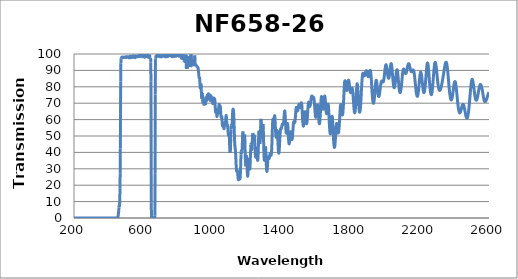
| Category | Transmission (%) |
|---|---|
| 2600.0 | 76.495 |
| 2599.0 | 76.409 |
| 2598.0 | 76.32 |
| 2597.0 | 76.13 |
| 2596.0 | 75.853 |
| 2595.0 | 75.54 |
| 2594.0 | 75.215 |
| 2593.0 | 74.875 |
| 2592.0 | 74.459 |
| 2591.0 | 74.133 |
| 2590.0 | 73.738 |
| 2589.0 | 73.397 |
| 2588.0 | 73.108 |
| 2587.0 | 72.826 |
| 2586.0 | 72.492 |
| 2585.0 | 72.167 |
| 2584.0 | 71.843 |
| 2583.0 | 71.6 |
| 2582.0 | 71.38 |
| 2581.0 | 71.221 |
| 2580.0 | 71.106 |
| 2579.0 | 71.011 |
| 2578.0 | 70.978 |
| 2577.0 | 70.971 |
| 2576.0 | 70.971 |
| 2575.0 | 71.068 |
| 2574.0 | 71.209 |
| 2573.0 | 71.421 |
| 2572.0 | 71.724 |
| 2571.0 | 72.112 |
| 2570.0 | 72.565 |
| 2569.0 | 73.155 |
| 2568.0 | 73.689 |
| 2567.0 | 74.33 |
| 2566.0 | 74.969 |
| 2565.0 | 75.629 |
| 2564.0 | 76.266 |
| 2563.0 | 76.9 |
| 2562.0 | 77.528 |
| 2561.0 | 78.076 |
| 2560.0 | 78.592 |
| 2559.0 | 79.073 |
| 2558.0 | 79.54 |
| 2557.0 | 79.952 |
| 2556.0 | 80.332 |
| 2555.0 | 80.634 |
| 2554.0 | 80.89 |
| 2553.0 | 81.133 |
| 2552.0 | 81.311 |
| 2551.0 | 81.387 |
| 2550.0 | 81.414 |
| 2549.0 | 81.342 |
| 2548.0 | 81.162 |
| 2547.0 | 80.871 |
| 2546.0 | 80.526 |
| 2545.0 | 80.151 |
| 2544.0 | 79.684 |
| 2543.0 | 79.217 |
| 2542.0 | 78.659 |
| 2541.0 | 78.131 |
| 2540.0 | 77.584 |
| 2539.0 | 76.984 |
| 2538.0 | 76.328 |
| 2537.0 | 75.659 |
| 2536.0 | 75.042 |
| 2535.0 | 74.496 |
| 2534.0 | 73.933 |
| 2533.0 | 73.467 |
| 2532.0 | 73.031 |
| 2531.0 | 72.627 |
| 2530.0 | 72.244 |
| 2529.0 | 72.003 |
| 2528.0 | 71.897 |
| 2527.0 | 71.824 |
| 2526.0 | 71.833 |
| 2525.0 | 71.914 |
| 2524.0 | 72.063 |
| 2523.0 | 72.305 |
| 2522.0 | 72.639 |
| 2521.0 | 73.029 |
| 2520.0 | 73.538 |
| 2519.0 | 74.135 |
| 2518.0 | 74.8 |
| 2517.0 | 75.566 |
| 2516.0 | 76.387 |
| 2515.0 | 77.208 |
| 2514.0 | 78.04 |
| 2513.0 | 78.874 |
| 2512.0 | 79.705 |
| 2511.0 | 80.519 |
| 2510.0 | 81.334 |
| 2509.0 | 82.048 |
| 2508.0 | 82.728 |
| 2507.0 | 83.314 |
| 2506.0 | 83.803 |
| 2505.0 | 84.173 |
| 2504.0 | 84.427 |
| 2503.0 | 84.54 |
| 2502.0 | 84.513 |
| 2501.0 | 84.3 |
| 2500.0 | 83.919 |
| 2499.0 | 83.403 |
| 2498.0 | 82.756 |
| 2497.0 | 81.971 |
| 2496.0 | 81.099 |
| 2495.0 | 80.129 |
| 2494.0 | 79.06 |
| 2493.0 | 77.856 |
| 2492.0 | 76.65 |
| 2491.0 | 75.4 |
| 2490.0 | 74.142 |
| 2489.0 | 72.907 |
| 2488.0 | 71.695 |
| 2487.0 | 70.524 |
| 2486.0 | 69.337 |
| 2485.0 | 68.188 |
| 2484.0 | 67.08 |
| 2483.0 | 66.094 |
| 2482.0 | 65.18 |
| 2481.0 | 64.321 |
| 2480.0 | 63.587 |
| 2479.0 | 62.937 |
| 2478.0 | 62.362 |
| 2477.0 | 61.887 |
| 2476.0 | 61.492 |
| 2475.0 | 61.199 |
| 2474.0 | 61.006 |
| 2473.0 | 60.915 |
| 2472.0 | 60.911 |
| 2471.0 | 60.984 |
| 2470.0 | 61.124 |
| 2469.0 | 61.353 |
| 2468.0 | 61.675 |
| 2467.0 | 62.037 |
| 2466.0 | 62.456 |
| 2465.0 | 62.942 |
| 2464.0 | 63.494 |
| 2463.0 | 64.055 |
| 2462.0 | 64.641 |
| 2461.0 | 65.209 |
| 2460.0 | 65.769 |
| 2459.0 | 66.324 |
| 2458.0 | 66.867 |
| 2457.0 | 67.392 |
| 2456.0 | 67.86 |
| 2455.0 | 68.25 |
| 2454.0 | 68.59 |
| 2453.0 | 68.873 |
| 2452.0 | 69.098 |
| 2451.0 | 69.234 |
| 2450.0 | 69.29 |
| 2449.0 | 69.274 |
| 2448.0 | 69.17 |
| 2447.0 | 69.005 |
| 2446.0 | 68.792 |
| 2445.0 | 68.509 |
| 2444.0 | 68.149 |
| 2443.0 | 67.776 |
| 2442.0 | 67.405 |
| 2441.0 | 67.006 |
| 2440.0 | 66.566 |
| 2439.0 | 66.11 |
| 2438.0 | 65.677 |
| 2437.0 | 65.274 |
| 2436.0 | 64.904 |
| 2435.0 | 64.6 |
| 2434.0 | 64.364 |
| 2433.0 | 64.199 |
| 2432.0 | 64.097 |
| 2431.0 | 64.05 |
| 2430.0 | 64.094 |
| 2429.0 | 64.235 |
| 2428.0 | 64.468 |
| 2427.0 | 64.779 |
| 2426.0 | 65.18 |
| 2425.0 | 65.68 |
| 2424.0 | 66.28 |
| 2423.0 | 66.969 |
| 2422.0 | 67.726 |
| 2421.0 | 68.543 |
| 2420.0 | 69.447 |
| 2419.0 | 70.427 |
| 2418.0 | 71.44 |
| 2417.0 | 72.499 |
| 2416.0 | 73.608 |
| 2415.0 | 74.72 |
| 2414.0 | 75.829 |
| 2413.0 | 76.925 |
| 2412.0 | 77.946 |
| 2411.0 | 78.907 |
| 2410.0 | 79.812 |
| 2409.0 | 80.644 |
| 2408.0 | 81.404 |
| 2407.0 | 82.067 |
| 2406.0 | 82.571 |
| 2405.0 | 82.915 |
| 2404.0 | 83.136 |
| 2403.0 | 83.213 |
| 2402.0 | 83.129 |
| 2401.0 | 82.928 |
| 2400.0 | 82.621 |
| 2399.0 | 82.181 |
| 2398.0 | 81.61 |
| 2397.0 | 80.934 |
| 2396.0 | 80.197 |
| 2395.0 | 79.392 |
| 2394.0 | 78.541 |
| 2393.0 | 77.725 |
| 2392.0 | 76.932 |
| 2391.0 | 76.114 |
| 2390.0 | 75.334 |
| 2389.0 | 74.619 |
| 2388.0 | 73.967 |
| 2387.0 | 73.398 |
| 2386.0 | 72.901 |
| 2385.0 | 72.53 |
| 2384.0 | 72.277 |
| 2383.0 | 72.089 |
| 2382.0 | 71.993 |
| 2381.0 | 72.019 |
| 2380.0 | 72.148 |
| 2379.0 | 72.402 |
| 2378.0 | 72.775 |
| 2377.0 | 73.243 |
| 2376.0 | 73.8 |
| 2375.0 | 74.452 |
| 2374.0 | 75.21 |
| 2373.0 | 76.052 |
| 2372.0 | 76.965 |
| 2371.0 | 77.954 |
| 2370.0 | 79.008 |
| 2369.0 | 80.146 |
| 2368.0 | 81.312 |
| 2367.0 | 82.496 |
| 2366.0 | 83.714 |
| 2365.0 | 84.945 |
| 2364.0 | 86.15 |
| 2363.0 | 87.334 |
| 2362.0 | 88.523 |
| 2361.0 | 89.638 |
| 2360.0 | 90.678 |
| 2359.0 | 91.639 |
| 2358.0 | 92.477 |
| 2357.0 | 93.212 |
| 2356.0 | 93.813 |
| 2355.0 | 94.303 |
| 2354.0 | 94.68 |
| 2353.0 | 94.917 |
| 2352.0 | 95.015 |
| 2351.0 | 95.035 |
| 2350.0 | 94.907 |
| 2349.0 | 94.658 |
| 2348.0 | 94.324 |
| 2347.0 | 93.911 |
| 2346.0 | 93.448 |
| 2345.0 | 92.898 |
| 2344.0 | 92.342 |
| 2343.0 | 91.72 |
| 2342.0 | 91.065 |
| 2341.0 | 90.391 |
| 2340.0 | 89.706 |
| 2339.0 | 89.019 |
| 2338.0 | 88.344 |
| 2337.0 | 87.693 |
| 2336.0 | 87.039 |
| 2335.0 | 86.388 |
| 2334.0 | 85.738 |
| 2333.0 | 85.082 |
| 2332.0 | 84.486 |
| 2331.0 | 83.885 |
| 2330.0 | 83.292 |
| 2329.0 | 82.741 |
| 2328.0 | 82.194 |
| 2327.0 | 81.684 |
| 2326.0 | 81.163 |
| 2325.0 | 80.65 |
| 2324.0 | 80.172 |
| 2323.0 | 79.741 |
| 2322.0 | 79.358 |
| 2321.0 | 78.993 |
| 2320.0 | 78.66 |
| 2319.0 | 78.373 |
| 2318.0 | 78.142 |
| 2317.0 | 77.942 |
| 2316.0 | 77.813 |
| 2315.0 | 77.762 |
| 2314.0 | 77.79 |
| 2313.0 | 77.89 |
| 2312.0 | 78.071 |
| 2311.0 | 78.334 |
| 2310.0 | 78.687 |
| 2309.0 | 79.135 |
| 2308.0 | 79.651 |
| 2307.0 | 80.286 |
| 2306.0 | 80.965 |
| 2305.0 | 81.736 |
| 2304.0 | 82.592 |
| 2303.0 | 83.545 |
| 2302.0 | 84.57 |
| 2301.0 | 85.586 |
| 2300.0 | 86.652 |
| 2299.0 | 87.748 |
| 2298.0 | 88.831 |
| 2297.0 | 89.883 |
| 2296.0 | 90.894 |
| 2295.0 | 91.828 |
| 2294.0 | 92.687 |
| 2293.0 | 93.422 |
| 2292.0 | 94.022 |
| 2291.0 | 94.479 |
| 2290.0 | 94.778 |
| 2289.0 | 94.896 |
| 2288.0 | 94.831 |
| 2287.0 | 94.584 |
| 2286.0 | 94.128 |
| 2285.0 | 93.447 |
| 2284.0 | 92.644 |
| 2283.0 | 91.668 |
| 2282.0 | 90.545 |
| 2281.0 | 89.353 |
| 2280.0 | 88.027 |
| 2279.0 | 86.707 |
| 2278.0 | 85.363 |
| 2277.0 | 83.966 |
| 2276.0 | 82.61 |
| 2275.0 | 81.32 |
| 2274.0 | 80.096 |
| 2273.0 | 78.986 |
| 2272.0 | 78.001 |
| 2271.0 | 77.145 |
| 2270.0 | 76.496 |
| 2269.0 | 75.927 |
| 2268.0 | 75.502 |
| 2267.0 | 75.273 |
| 2266.0 | 75.22 |
| 2265.0 | 75.319 |
| 2264.0 | 75.602 |
| 2263.0 | 76.034 |
| 2262.0 | 76.646 |
| 2261.0 | 77.388 |
| 2260.0 | 78.268 |
| 2259.0 | 79.281 |
| 2258.0 | 80.401 |
| 2257.0 | 81.66 |
| 2256.0 | 82.922 |
| 2255.0 | 84.26 |
| 2254.0 | 85.663 |
| 2253.0 | 87.085 |
| 2252.0 | 88.416 |
| 2251.0 | 89.735 |
| 2250.0 | 90.938 |
| 2249.0 | 92.022 |
| 2248.0 | 92.953 |
| 2247.0 | 93.674 |
| 2246.0 | 94.138 |
| 2245.0 | 94.452 |
| 2244.0 | 94.453 |
| 2243.0 | 94.223 |
| 2242.0 | 93.71 |
| 2241.0 | 93.033 |
| 2240.0 | 92.127 |
| 2239.0 | 91.004 |
| 2238.0 | 89.746 |
| 2237.0 | 88.451 |
| 2236.0 | 87.066 |
| 2235.0 | 85.664 |
| 2234.0 | 84.247 |
| 2233.0 | 82.901 |
| 2232.0 | 81.64 |
| 2231.0 | 80.481 |
| 2230.0 | 79.5 |
| 2229.0 | 78.555 |
| 2228.0 | 77.791 |
| 2227.0 | 77.2 |
| 2226.0 | 76.787 |
| 2225.0 | 76.517 |
| 2224.0 | 76.425 |
| 2223.0 | 76.521 |
| 2222.0 | 76.753 |
| 2221.0 | 77.148 |
| 2220.0 | 77.688 |
| 2219.0 | 78.358 |
| 2218.0 | 79.117 |
| 2217.0 | 79.975 |
| 2216.0 | 80.936 |
| 2215.0 | 81.907 |
| 2214.0 | 82.938 |
| 2213.0 | 84.019 |
| 2212.0 | 84.961 |
| 2211.0 | 85.931 |
| 2210.0 | 86.796 |
| 2209.0 | 87.523 |
| 2208.0 | 88.125 |
| 2207.0 | 88.563 |
| 2206.0 | 88.824 |
| 2205.0 | 88.928 |
| 2204.0 | 88.787 |
| 2203.0 | 88.413 |
| 2202.0 | 87.878 |
| 2201.0 | 87.128 |
| 2200.0 | 86.29 |
| 2199.0 | 85.287 |
| 2198.0 | 84.215 |
| 2197.0 | 83.017 |
| 2196.0 | 81.876 |
| 2195.0 | 80.682 |
| 2194.0 | 79.587 |
| 2193.0 | 78.523 |
| 2192.0 | 77.551 |
| 2191.0 | 76.664 |
| 2190.0 | 75.891 |
| 2189.0 | 75.264 |
| 2188.0 | 74.752 |
| 2187.0 | 74.392 |
| 2186.0 | 74.218 |
| 2185.0 | 74.193 |
| 2184.0 | 74.315 |
| 2183.0 | 74.555 |
| 2182.0 | 74.983 |
| 2181.0 | 75.541 |
| 2180.0 | 76.151 |
| 2179.0 | 76.902 |
| 2178.0 | 77.762 |
| 2177.0 | 78.767 |
| 2176.0 | 79.745 |
| 2175.0 | 80.778 |
| 2174.0 | 81.865 |
| 2173.0 | 82.965 |
| 2172.0 | 84.038 |
| 2171.0 | 85.124 |
| 2170.0 | 86.09 |
| 2169.0 | 86.996 |
| 2168.0 | 87.812 |
| 2167.0 | 88.499 |
| 2166.0 | 89.095 |
| 2165.0 | 89.635 |
| 2164.0 | 89.935 |
| 2163.0 | 90.137 |
| 2162.0 | 90.275 |
| 2161.0 | 90.296 |
| 2160.0 | 90.253 |
| 2159.0 | 90.144 |
| 2158.0 | 89.977 |
| 2157.0 | 89.787 |
| 2156.0 | 89.596 |
| 2155.0 | 89.406 |
| 2154.0 | 89.253 |
| 2153.0 | 89.176 |
| 2152.0 | 89.165 |
| 2151.0 | 89.229 |
| 2150.0 | 89.328 |
| 2149.0 | 89.488 |
| 2148.0 | 89.744 |
| 2147.0 | 90.086 |
| 2146.0 | 90.477 |
| 2145.0 | 90.923 |
| 2144.0 | 91.368 |
| 2143.0 | 91.844 |
| 2142.0 | 92.317 |
| 2141.0 | 92.763 |
| 2140.0 | 93.192 |
| 2139.0 | 93.521 |
| 2138.0 | 93.792 |
| 2137.0 | 94 |
| 2136.0 | 94.11 |
| 2135.0 | 94.096 |
| 2134.0 | 93.97 |
| 2133.0 | 93.798 |
| 2132.0 | 93.526 |
| 2131.0 | 93.168 |
| 2130.0 | 92.735 |
| 2129.0 | 92.236 |
| 2128.0 | 91.706 |
| 2127.0 | 91.175 |
| 2126.0 | 90.621 |
| 2125.0 | 90.085 |
| 2124.0 | 89.572 |
| 2123.0 | 89.102 |
| 2122.0 | 88.731 |
| 2121.0 | 88.414 |
| 2120.0 | 88.207 |
| 2119.0 | 88.094 |
| 2118.0 | 88.066 |
| 2117.0 | 88.132 |
| 2116.0 | 88.326 |
| 2115.0 | 88.555 |
| 2114.0 | 88.83 |
| 2113.0 | 89.181 |
| 2112.0 | 89.567 |
| 2111.0 | 89.902 |
| 2110.0 | 90.228 |
| 2109.0 | 90.538 |
| 2108.0 | 90.745 |
| 2107.0 | 90.855 |
| 2106.0 | 90.843 |
| 2105.0 | 90.694 |
| 2104.0 | 90.381 |
| 2103.0 | 89.904 |
| 2102.0 | 89.307 |
| 2101.0 | 88.557 |
| 2100.0 | 87.695 |
| 2099.0 | 86.736 |
| 2098.0 | 85.716 |
| 2097.0 | 84.647 |
| 2096.0 | 83.513 |
| 2095.0 | 82.405 |
| 2094.0 | 81.302 |
| 2093.0 | 80.279 |
| 2092.0 | 79.381 |
| 2091.0 | 78.553 |
| 2090.0 | 77.85 |
| 2089.0 | 77.302 |
| 2088.0 | 76.856 |
| 2087.0 | 76.574 |
| 2086.0 | 76.45 |
| 2085.0 | 76.501 |
| 2084.0 | 76.729 |
| 2083.0 | 77.159 |
| 2082.0 | 77.715 |
| 2081.0 | 78.426 |
| 2080.0 | 79.3 |
| 2079.0 | 80.312 |
| 2078.0 | 81.425 |
| 2077.0 | 82.623 |
| 2076.0 | 83.816 |
| 2075.0 | 85.063 |
| 2074.0 | 86.281 |
| 2073.0 | 87.391 |
| 2072.0 | 88.388 |
| 2071.0 | 89.238 |
| 2070.0 | 89.848 |
| 2069.0 | 90.24 |
| 2068.0 | 90.384 |
| 2067.0 | 90.287 |
| 2066.0 | 89.948 |
| 2065.0 | 89.396 |
| 2064.0 | 88.663 |
| 2063.0 | 87.757 |
| 2062.0 | 86.734 |
| 2061.0 | 85.694 |
| 2060.0 | 84.633 |
| 2059.0 | 83.591 |
| 2058.0 | 82.61 |
| 2057.0 | 81.712 |
| 2056.0 | 80.943 |
| 2055.0 | 80.313 |
| 2054.0 | 79.828 |
| 2053.0 | 79.534 |
| 2052.0 | 79.423 |
| 2051.0 | 79.475 |
| 2050.0 | 79.721 |
| 2049.0 | 80.153 |
| 2048.0 | 80.775 |
| 2047.0 | 81.564 |
| 2046.0 | 82.502 |
| 2045.0 | 83.59 |
| 2044.0 | 84.776 |
| 2043.0 | 86.058 |
| 2042.0 | 87.411 |
| 2041.0 | 88.733 |
| 2040.0 | 89.97 |
| 2039.0 | 91.11 |
| 2038.0 | 92.131 |
| 2037.0 | 93.018 |
| 2036.0 | 93.65 |
| 2035.0 | 94.009 |
| 2034.0 | 94.15 |
| 2033.0 | 94.025 |
| 2032.0 | 93.654 |
| 2031.0 | 93.097 |
| 2030.0 | 92.383 |
| 2029.0 | 91.513 |
| 2028.0 | 90.552 |
| 2027.0 | 89.597 |
| 2026.0 | 88.655 |
| 2025.0 | 87.763 |
| 2024.0 | 86.982 |
| 2023.0 | 86.308 |
| 2022.0 | 85.784 |
| 2021.0 | 85.424 |
| 2020.0 | 85.233 |
| 2019.0 | 85.213 |
| 2018.0 | 85.359 |
| 2017.0 | 85.662 |
| 2016.0 | 86.11 |
| 2015.0 | 86.699 |
| 2014.0 | 87.398 |
| 2013.0 | 88.165 |
| 2012.0 | 89.017 |
| 2011.0 | 89.882 |
| 2010.0 | 90.759 |
| 2009.0 | 91.562 |
| 2008.0 | 92.226 |
| 2007.0 | 92.777 |
| 2006.0 | 93.194 |
| 2005.0 | 93.441 |
| 2004.0 | 93.487 |
| 2003.0 | 93.322 |
| 2002.0 | 92.95 |
| 2001.0 | 92.396 |
| 2000.0 | 91.67 |
| 1999.0 | 90.831 |
| 1998.0 | 89.895 |
| 1997.0 | 88.912 |
| 1996.0 | 87.94 |
| 1995.0 | 86.977 |
| 1994.0 | 86.056 |
| 1993.0 | 85.229 |
| 1992.0 | 84.518 |
| 1991.0 | 83.927 |
| 1990.0 | 83.482 |
| 1989.0 | 83.164 |
| 1988.0 | 82.947 |
| 1987.0 | 82.863 |
| 1986.0 | 82.869 |
| 1985.0 | 82.951 |
| 1984.0 | 83.081 |
| 1983.0 | 83.23 |
| 1982.0 | 83.369 |
| 1981.0 | 83.476 |
| 1980.0 | 83.519 |
| 1979.0 | 83.453 |
| 1978.0 | 83.295 |
| 1977.0 | 83.027 |
| 1976.0 | 82.623 |
| 1975.0 | 82.09 |
| 1974.0 | 81.444 |
| 1973.0 | 80.733 |
| 1972.0 | 79.899 |
| 1971.0 | 79.041 |
| 1970.0 | 78.212 |
| 1969.0 | 77.365 |
| 1968.0 | 76.505 |
| 1967.0 | 75.761 |
| 1966.0 | 75.15 |
| 1965.0 | 74.663 |
| 1964.0 | 74.277 |
| 1963.0 | 74.07 |
| 1962.0 | 74.036 |
| 1961.0 | 74.192 |
| 1960.0 | 74.541 |
| 1959.0 | 75.08 |
| 1958.0 | 75.751 |
| 1957.0 | 76.6 |
| 1956.0 | 77.529 |
| 1955.0 | 78.603 |
| 1954.0 | 79.696 |
| 1953.0 | 80.723 |
| 1952.0 | 81.749 |
| 1951.0 | 82.666 |
| 1950.0 | 83.34 |
| 1949.0 | 83.812 |
| 1948.0 | 84.025 |
| 1947.0 | 83.938 |
| 1946.0 | 83.537 |
| 1945.0 | 82.887 |
| 1944.0 | 81.962 |
| 1943.0 | 80.906 |
| 1942.0 | 79.682 |
| 1941.0 | 78.352 |
| 1940.0 | 76.945 |
| 1939.0 | 75.545 |
| 1938.0 | 74.218 |
| 1937.0 | 73 |
| 1936.0 | 71.998 |
| 1935.0 | 71.189 |
| 1934.0 | 70.548 |
| 1933.0 | 70.138 |
| 1932.0 | 69.931 |
| 1931.0 | 69.978 |
| 1930.0 | 70.23 |
| 1929.0 | 70.734 |
| 1928.0 | 71.495 |
| 1927.0 | 72.473 |
| 1926.0 | 73.657 |
| 1925.0 | 74.984 |
| 1924.0 | 76.434 |
| 1923.0 | 78.027 |
| 1922.0 | 79.839 |
| 1921.0 | 81.772 |
| 1920.0 | 83.596 |
| 1919.0 | 85.242 |
| 1918.0 | 86.724 |
| 1917.0 | 87.857 |
| 1916.0 | 88.733 |
| 1915.0 | 89.407 |
| 1914.0 | 89.894 |
| 1913.0 | 90.047 |
| 1912.0 | 89.941 |
| 1911.0 | 89.673 |
| 1910.0 | 89.291 |
| 1909.0 | 88.844 |
| 1908.0 | 88.32 |
| 1907.0 | 87.74 |
| 1906.0 | 87.143 |
| 1905.0 | 86.649 |
| 1904.0 | 86.308 |
| 1903.0 | 86.096 |
| 1902.0 | 86.074 |
| 1901.0 | 86.184 |
| 1900.0 | 86.462 |
| 1899.0 | 86.794 |
| 1898.0 | 87.159 |
| 1897.0 | 87.694 |
| 1896.0 | 88.136 |
| 1895.0 | 88.514 |
| 1894.0 | 88.987 |
| 1893.0 | 89.339 |
| 1892.0 | 89.641 |
| 1891.0 | 89.814 |
| 1890.0 | 89.771 |
| 1889.0 | 89.626 |
| 1888.0 | 89.479 |
| 1887.0 | 89.218 |
| 1886.0 | 88.857 |
| 1885.0 | 88.413 |
| 1884.0 | 87.944 |
| 1883.0 | 87.486 |
| 1882.0 | 87.097 |
| 1881.0 | 86.799 |
| 1880.0 | 86.659 |
| 1879.0 | 86.623 |
| 1878.0 | 86.676 |
| 1877.0 | 86.872 |
| 1876.0 | 87.179 |
| 1875.0 | 87.482 |
| 1874.0 | 87.815 |
| 1873.0 | 88.038 |
| 1872.0 | 88.232 |
| 1871.0 | 88.268 |
| 1870.0 | 88.078 |
| 1869.0 | 87.587 |
| 1868.0 | 86.813 |
| 1867.0 | 85.785 |
| 1866.0 | 84.556 |
| 1865.0 | 83.071 |
| 1864.0 | 81.392 |
| 1863.0 | 79.567 |
| 1862.0 | 77.652 |
| 1861.0 | 75.404 |
| 1860.0 | 73.223 |
| 1859.0 | 71.191 |
| 1858.0 | 69.442 |
| 1857.0 | 67.973 |
| 1856.0 | 66.793 |
| 1855.0 | 65.82 |
| 1854.0 | 65.071 |
| 1853.0 | 64.631 |
| 1852.0 | 64.461 |
| 1851.0 | 64.608 |
| 1850.0 | 65.147 |
| 1849.0 | 66.042 |
| 1848.0 | 67.405 |
| 1847.0 | 68.913 |
| 1846.0 | 70.651 |
| 1845.0 | 72.109 |
| 1844.0 | 73.716 |
| 1843.0 | 75.611 |
| 1842.0 | 77.558 |
| 1841.0 | 79.414 |
| 1840.0 | 80.747 |
| 1839.0 | 81.598 |
| 1838.0 | 81.907 |
| 1837.0 | 81.738 |
| 1836.0 | 81.013 |
| 1835.0 | 79.793 |
| 1834.0 | 78.367 |
| 1833.0 | 76.814 |
| 1832.0 | 74.901 |
| 1831.0 | 72.905 |
| 1830.0 | 70.749 |
| 1829.0 | 68.926 |
| 1828.0 | 67.428 |
| 1827.0 | 66.107 |
| 1826.0 | 65.027 |
| 1825.0 | 64.442 |
| 1824.0 | 64.145 |
| 1823.0 | 64.229 |
| 1822.0 | 64.631 |
| 1821.0 | 65.223 |
| 1820.0 | 66.083 |
| 1819.0 | 67.132 |
| 1818.0 | 68.396 |
| 1817.0 | 69.867 |
| 1816.0 | 71.561 |
| 1815.0 | 73.088 |
| 1814.0 | 74.538 |
| 1813.0 | 75.849 |
| 1812.0 | 77.04 |
| 1811.0 | 77.987 |
| 1810.0 | 78.672 |
| 1809.0 | 79.099 |
| 1808.0 | 79.175 |
| 1807.0 | 79.024 |
| 1806.0 | 78.694 |
| 1805.0 | 78.214 |
| 1804.0 | 77.708 |
| 1803.0 | 77.193 |
| 1802.0 | 76.814 |
| 1801.0 | 76.522 |
| 1800.0 | 76.404 |
| 1799.0 | 76.496 |
| 1798.0 | 76.794 |
| 1797.0 | 77.358 |
| 1796.0 | 78.024 |
| 1795.0 | 78.911 |
| 1794.0 | 79.887 |
| 1793.0 | 80.865 |
| 1792.0 | 81.864 |
| 1791.0 | 82.765 |
| 1790.0 | 83.44 |
| 1789.0 | 83.906 |
| 1788.0 | 84.078 |
| 1787.0 | 83.954 |
| 1786.0 | 83.558 |
| 1785.0 | 82.955 |
| 1784.0 | 82.15 |
| 1783.0 | 81.247 |
| 1782.0 | 80.333 |
| 1781.0 | 79.504 |
| 1780.0 | 78.73 |
| 1779.0 | 78.173 |
| 1778.0 | 77.832 |
| 1777.0 | 77.734 |
| 1776.0 | 77.883 |
| 1775.0 | 78.287 |
| 1774.0 | 78.881 |
| 1773.0 | 79.664 |
| 1772.0 | 80.567 |
| 1771.0 | 81.505 |
| 1770.0 | 82.394 |
| 1769.0 | 83.16 |
| 1768.0 | 83.601 |
| 1767.0 | 83.706 |
| 1766.0 | 83.365 |
| 1765.0 | 82.587 |
| 1764.0 | 81.334 |
| 1763.0 | 79.706 |
| 1762.0 | 77.747 |
| 1761.0 | 75.583 |
| 1760.0 | 73.273 |
| 1759.0 | 71.066 |
| 1758.0 | 68.944 |
| 1757.0 | 67.117 |
| 1756.0 | 65.524 |
| 1755.0 | 64.257 |
| 1754.0 | 63.43 |
| 1753.0 | 62.951 |
| 1752.0 | 62.824 |
| 1751.0 | 63.046 |
| 1750.0 | 63.58 |
| 1749.0 | 64.365 |
| 1748.0 | 65.343 |
| 1747.0 | 66.401 |
| 1746.0 | 67.45 |
| 1745.0 | 68.338 |
| 1744.0 | 68.964 |
| 1743.0 | 69.221 |
| 1742.0 | 69.033 |
| 1741.0 | 68.404 |
| 1740.0 | 67.297 |
| 1739.0 | 65.809 |
| 1738.0 | 64.118 |
| 1737.0 | 62.233 |
| 1736.0 | 60.28 |
| 1735.0 | 58.38 |
| 1734.0 | 56.611 |
| 1733.0 | 55.109 |
| 1732.0 | 53.83 |
| 1731.0 | 52.853 |
| 1730.0 | 52.181 |
| 1729.0 | 51.835 |
| 1728.0 | 51.809 |
| 1727.0 | 52.088 |
| 1726.0 | 52.636 |
| 1725.0 | 53.376 |
| 1724.0 | 54.281 |
| 1723.0 | 55.257 |
| 1722.0 | 56.195 |
| 1721.0 | 56.988 |
| 1720.0 | 57.5 |
| 1719.0 | 57.651 |
| 1718.0 | 57.362 |
| 1717.0 | 56.635 |
| 1716.0 | 55.496 |
| 1715.0 | 53.99 |
| 1714.0 | 52.255 |
| 1713.0 | 50.433 |
| 1712.0 | 48.649 |
| 1711.0 | 47.076 |
| 1710.0 | 45.647 |
| 1709.0 | 44.482 |
| 1708.0 | 43.652 |
| 1707.0 | 43.166 |
| 1706.0 | 43.03 |
| 1705.0 | 43.262 |
| 1704.0 | 43.891 |
| 1703.0 | 44.897 |
| 1702.0 | 46.259 |
| 1701.0 | 48.023 |
| 1700.0 | 50.055 |
| 1699.0 | 52.169 |
| 1698.0 | 54.458 |
| 1697.0 | 56.638 |
| 1696.0 | 58.636 |
| 1695.0 | 60.298 |
| 1694.0 | 61.431 |
| 1693.0 | 61.987 |
| 1692.0 | 61.936 |
| 1691.0 | 61.31 |
| 1690.0 | 60.193 |
| 1689.0 | 58.742 |
| 1688.0 | 57.153 |
| 1687.0 | 55.607 |
| 1686.0 | 54.131 |
| 1685.0 | 52.92 |
| 1684.0 | 52.008 |
| 1683.0 | 51.465 |
| 1682.0 | 51.334 |
| 1681.0 | 51.635 |
| 1680.0 | 52.357 |
| 1679.0 | 53.498 |
| 1678.0 | 55.051 |
| 1677.0 | 56.928 |
| 1676.0 | 59.07 |
| 1675.0 | 61.403 |
| 1674.0 | 63.668 |
| 1673.0 | 65.731 |
| 1672.0 | 67.467 |
| 1671.0 | 68.683 |
| 1670.0 | 69.357 |
| 1669.0 | 69.48 |
| 1668.0 | 69.107 |
| 1667.0 | 68.291 |
| 1666.0 | 67.224 |
| 1665.0 | 66.112 |
| 1664.0 | 65.077 |
| 1663.0 | 64.241 |
| 1662.0 | 63.702 |
| 1661.0 | 63.519 |
| 1660.0 | 63.688 |
| 1659.0 | 64.209 |
| 1658.0 | 65.097 |
| 1657.0 | 66.276 |
| 1656.0 | 67.678 |
| 1655.0 | 69.231 |
| 1654.0 | 70.775 |
| 1653.0 | 72.175 |
| 1652.0 | 73.321 |
| 1651.0 | 74.085 |
| 1650.0 | 74.41 |
| 1649.0 | 74.275 |
| 1648.0 | 73.699 |
| 1647.0 | 72.737 |
| 1646.0 | 71.518 |
| 1645.0 | 70.207 |
| 1644.0 | 68.937 |
| 1643.0 | 67.807 |
| 1642.0 | 66.957 |
| 1641.0 | 66.461 |
| 1640.0 | 66.325 |
| 1639.0 | 66.598 |
| 1638.0 | 67.262 |
| 1637.0 | 68.3 |
| 1636.0 | 69.551 |
| 1635.0 | 70.885 |
| 1634.0 | 72.172 |
| 1633.0 | 73.247 |
| 1632.0 | 73.934 |
| 1631.0 | 74.059 |
| 1630.0 | 73.557 |
| 1629.0 | 72.434 |
| 1628.0 | 70.847 |
| 1627.0 | 68.886 |
| 1626.0 | 66.711 |
| 1625.0 | 64.474 |
| 1624.0 | 62.37 |
| 1623.0 | 60.604 |
| 1622.0 | 59.176 |
| 1621.0 | 58.175 |
| 1620.0 | 57.614 |
| 1619.0 | 57.466 |
| 1618.0 | 57.746 |
| 1617.0 | 58.438 |
| 1616.0 | 59.502 |
| 1615.0 | 60.854 |
| 1614.0 | 62.401 |
| 1613.0 | 64.052 |
| 1612.0 | 65.68 |
| 1611.0 | 67.096 |
| 1610.0 | 68.208 |
| 1609.0 | 68.909 |
| 1608.0 | 69.117 |
| 1607.0 | 68.842 |
| 1606.0 | 68.158 |
| 1605.0 | 67.14 |
| 1604.0 | 65.931 |
| 1603.0 | 64.668 |
| 1602.0 | 63.495 |
| 1601.0 | 62.517 |
| 1600.0 | 61.806 |
| 1599.0 | 61.422 |
| 1598.0 | 61.411 |
| 1597.0 | 61.78 |
| 1596.0 | 62.498 |
| 1595.0 | 63.512 |
| 1594.0 | 64.741 |
| 1593.0 | 66.235 |
| 1592.0 | 67.71 |
| 1591.0 | 69.125 |
| 1590.0 | 70.462 |
| 1589.0 | 71.57 |
| 1588.0 | 72.417 |
| 1587.0 | 73.035 |
| 1586.0 | 73.422 |
| 1585.0 | 73.619 |
| 1584.0 | 73.691 |
| 1583.0 | 73.692 |
| 1582.0 | 73.713 |
| 1581.0 | 73.762 |
| 1580.0 | 73.863 |
| 1579.0 | 74.007 |
| 1578.0 | 74.181 |
| 1577.0 | 74.324 |
| 1576.0 | 74.393 |
| 1575.0 | 74.366 |
| 1574.0 | 74.173 |
| 1573.0 | 73.784 |
| 1572.0 | 73.207 |
| 1571.0 | 72.492 |
| 1570.0 | 71.644 |
| 1569.0 | 70.734 |
| 1568.0 | 69.892 |
| 1567.0 | 69.136 |
| 1566.0 | 68.522 |
| 1565.0 | 68.143 |
| 1564.0 | 68.016 |
| 1563.0 | 68.132 |
| 1562.0 | 68.476 |
| 1561.0 | 68.989 |
| 1560.0 | 69.568 |
| 1559.0 | 70.127 |
| 1558.0 | 70.535 |
| 1557.0 | 70.637 |
| 1556.0 | 70.383 |
| 1555.0 | 69.679 |
| 1554.0 | 68.578 |
| 1553.0 | 67.065 |
| 1552.0 | 65.359 |
| 1551.0 | 63.528 |
| 1550.0 | 61.771 |
| 1549.0 | 60.172 |
| 1548.0 | 58.941 |
| 1547.0 | 58.044 |
| 1546.0 | 57.547 |
| 1545.0 | 57.484 |
| 1544.0 | 57.809 |
| 1543.0 | 58.532 |
| 1542.0 | 59.524 |
| 1541.0 | 60.732 |
| 1540.0 | 61.997 |
| 1539.0 | 63.201 |
| 1538.0 | 64.172 |
| 1537.0 | 64.729 |
| 1536.0 | 64.815 |
| 1535.0 | 64.442 |
| 1534.0 | 63.601 |
| 1533.0 | 62.395 |
| 1532.0 | 61.022 |
| 1531.0 | 59.615 |
| 1530.0 | 58.31 |
| 1529.0 | 57.187 |
| 1528.0 | 56.419 |
| 1527.0 | 55.995 |
| 1526.0 | 56.064 |
| 1525.0 | 56.577 |
| 1524.0 | 57.538 |
| 1523.0 | 58.91 |
| 1522.0 | 60.631 |
| 1521.0 | 62.568 |
| 1520.0 | 64.541 |
| 1519.0 | 66.474 |
| 1518.0 | 68.178 |
| 1517.0 | 69.369 |
| 1516.0 | 70.086 |
| 1515.0 | 70.316 |
| 1514.0 | 70.124 |
| 1513.0 | 69.567 |
| 1512.0 | 68.881 |
| 1511.0 | 68.262 |
| 1510.0 | 67.72 |
| 1509.0 | 67.408 |
| 1508.0 | 67.358 |
| 1507.0 | 67.555 |
| 1506.0 | 67.91 |
| 1505.0 | 68.361 |
| 1504.0 | 68.857 |
| 1503.0 | 69.241 |
| 1502.0 | 69.436 |
| 1501.0 | 69.396 |
| 1500.0 | 69.108 |
| 1499.0 | 68.589 |
| 1498.0 | 67.887 |
| 1497.0 | 67.094 |
| 1496.0 | 66.425 |
| 1495.0 | 65.84 |
| 1494.0 | 65.432 |
| 1493.0 | 65.266 |
| 1492.0 | 65.345 |
| 1491.0 | 65.663 |
| 1490.0 | 66.107 |
| 1489.0 | 66.632 |
| 1488.0 | 67.097 |
| 1487.0 | 67.394 |
| 1486.0 | 67.41 |
| 1485.0 | 67.075 |
| 1484.0 | 66.318 |
| 1483.0 | 65.256 |
| 1482.0 | 63.954 |
| 1481.0 | 62.545 |
| 1480.0 | 61.199 |
| 1479.0 | 59.974 |
| 1478.0 | 59.067 |
| 1477.0 | 58.42 |
| 1476.0 | 58.096 |
| 1475.0 | 58.069 |
| 1474.0 | 58.266 |
| 1473.0 | 58.527 |
| 1472.0 | 58.739 |
| 1471.0 | 58.721 |
| 1470.0 | 58.35 |
| 1469.0 | 57.613 |
| 1468.0 | 56.493 |
| 1467.0 | 54.99 |
| 1466.0 | 53.47 |
| 1465.0 | 51.902 |
| 1464.0 | 50.432 |
| 1463.0 | 49.232 |
| 1462.0 | 48.382 |
| 1461.0 | 47.901 |
| 1460.0 | 47.878 |
| 1459.0 | 48.218 |
| 1458.0 | 48.838 |
| 1457.0 | 49.724 |
| 1456.0 | 50.679 |
| 1455.0 | 51.656 |
| 1454.0 | 52.285 |
| 1453.0 | 52.564 |
| 1452.0 | 52.406 |
| 1451.0 | 51.782 |
| 1450.0 | 50.708 |
| 1449.0 | 49.416 |
| 1448.0 | 48.047 |
| 1447.0 | 46.809 |
| 1446.0 | 45.916 |
| 1445.0 | 45.335 |
| 1444.0 | 45.2 |
| 1443.0 | 45.58 |
| 1442.0 | 46.517 |
| 1441.0 | 47.986 |
| 1440.0 | 49.786 |
| 1439.0 | 51.917 |
| 1438.0 | 54.002 |
| 1437.0 | 55.794 |
| 1436.0 | 57.079 |
| 1435.0 | 57.663 |
| 1434.0 | 57.447 |
| 1433.0 | 56.573 |
| 1432.0 | 55.318 |
| 1431.0 | 53.951 |
| 1430.0 | 52.765 |
| 1429.0 | 51.955 |
| 1428.0 | 51.665 |
| 1427.0 | 51.987 |
| 1426.0 | 52.868 |
| 1425.0 | 54.39 |
| 1424.0 | 56.409 |
| 1423.0 | 58.686 |
| 1422.0 | 60.925 |
| 1421.0 | 62.923 |
| 1420.0 | 64.471 |
| 1419.0 | 65.249 |
| 1418.0 | 65.13 |
| 1417.0 | 64.341 |
| 1416.0 | 63.18 |
| 1415.0 | 61.764 |
| 1414.0 | 60.211 |
| 1413.0 | 58.812 |
| 1412.0 | 57.91 |
| 1411.0 | 57.307 |
| 1410.0 | 57.122 |
| 1409.0 | 57.105 |
| 1408.0 | 57.12 |
| 1407.0 | 57.199 |
| 1406.0 | 57.295 |
| 1405.0 | 57.21 |
| 1404.0 | 56.903 |
| 1403.0 | 56.403 |
| 1402.0 | 55.976 |
| 1401.0 | 55.588 |
| 1400.0 | 54.997 |
| 1399.0 | 54.467 |
| 1398.0 | 54.303 |
| 1397.0 | 54.416 |
| 1396.0 | 54.651 |
| 1395.0 | 54.432 |
| 1394.0 | 53.9 |
| 1393.0 | 52.954 |
| 1392.0 | 51.459 |
| 1391.0 | 49.639 |
| 1390.0 | 47.652 |
| 1389.0 | 45.547 |
| 1388.0 | 43.403 |
| 1387.0 | 41.5 |
| 1386.0 | 40.213 |
| 1385.0 | 39.583 |
| 1384.0 | 39.525 |
| 1383.0 | 40.06 |
| 1382.0 | 41.145 |
| 1381.0 | 42.813 |
| 1380.0 | 44.855 |
| 1379.0 | 47.317 |
| 1378.0 | 49.476 |
| 1377.0 | 51.467 |
| 1376.0 | 52.778 |
| 1375.0 | 53.309 |
| 1374.0 | 53.084 |
| 1373.0 | 52.315 |
| 1372.0 | 51.292 |
| 1371.0 | 50.215 |
| 1370.0 | 49.406 |
| 1369.0 | 49.173 |
| 1368.0 | 49.655 |
| 1367.0 | 50.701 |
| 1366.0 | 52.217 |
| 1365.0 | 54.482 |
| 1364.0 | 56.929 |
| 1363.0 | 59.068 |
| 1362.0 | 60.999 |
| 1361.0 | 62.153 |
| 1360.0 | 62.372 |
| 1359.0 | 61.796 |
| 1358.0 | 60.844 |
| 1357.0 | 60.002 |
| 1356.0 | 59.319 |
| 1355.0 | 58.98 |
| 1354.0 | 59.003 |
| 1353.0 | 59.413 |
| 1352.0 | 59.985 |
| 1351.0 | 60.316 |
| 1350.0 | 59.958 |
| 1349.0 | 58.679 |
| 1348.0 | 56.444 |
| 1347.0 | 53.459 |
| 1346.0 | 50.055 |
| 1345.0 | 46.678 |
| 1344.0 | 43.797 |
| 1343.0 | 41.417 |
| 1342.0 | 39.79 |
| 1341.0 | 38.77 |
| 1340.0 | 38.256 |
| 1339.0 | 38.192 |
| 1338.0 | 38.462 |
| 1337.0 | 38.899 |
| 1336.0 | 39.233 |
| 1335.0 | 39.364 |
| 1334.0 | 39.214 |
| 1333.0 | 38.775 |
| 1332.0 | 38.125 |
| 1331.0 | 37.401 |
| 1330.0 | 36.745 |
| 1329.0 | 36.307 |
| 1328.0 | 36.159 |
| 1327.0 | 36.295 |
| 1326.0 | 36.639 |
| 1325.0 | 37.057 |
| 1324.0 | 37.318 |
| 1323.0 | 37.212 |
| 1322.0 | 36.563 |
| 1321.0 | 35.356 |
| 1320.0 | 33.769 |
| 1319.0 | 32.004 |
| 1318.0 | 30.4 |
| 1317.0 | 29.177 |
| 1316.0 | 28.488 |
| 1315.0 | 28.451 |
| 1314.0 | 29.142 |
| 1313.0 | 30.588 |
| 1312.0 | 32.756 |
| 1311.0 | 35.621 |
| 1310.0 | 38.76 |
| 1309.0 | 41.444 |
| 1308.0 | 43.246 |
| 1307.0 | 43.643 |
| 1306.0 | 42.592 |
| 1305.0 | 40.591 |
| 1304.0 | 38.386 |
| 1303.0 | 36.532 |
| 1302.0 | 35.387 |
| 1301.0 | 35.188 |
| 1300.0 | 35.967 |
| 1299.0 | 37.836 |
| 1298.0 | 40.792 |
| 1297.0 | 44.713 |
| 1296.0 | 49.14 |
| 1295.0 | 53.262 |
| 1294.0 | 56.186 |
| 1293.0 | 57.298 |
| 1292.0 | 56.457 |
| 1291.0 | 54.317 |
| 1290.0 | 51.787 |
| 1289.0 | 49.692 |
| 1288.0 | 48.55 |
| 1287.0 | 48.631 |
| 1286.0 | 49.977 |
| 1285.0 | 52.453 |
| 1284.0 | 55.593 |
| 1283.0 | 58.595 |
| 1282.0 | 60.438 |
| 1281.0 | 60.289 |
| 1280.0 | 58.138 |
| 1279.0 | 54.658 |
| 1278.0 | 50.95 |
| 1277.0 | 47.844 |
| 1276.0 | 45.818 |
| 1275.0 | 45.113 |
| 1274.0 | 45.747 |
| 1273.0 | 47.495 |
| 1272.0 | 49.853 |
| 1271.0 | 52.076 |
| 1270.0 | 53.201 |
| 1269.0 | 52.558 |
| 1268.0 | 50.063 |
| 1267.0 | 46.356 |
| 1266.0 | 42.404 |
| 1265.0 | 39.059 |
| 1264.0 | 36.74 |
| 1263.0 | 35.427 |
| 1262.0 | 35.152 |
| 1261.0 | 35.844 |
| 1260.0 | 37.295 |
| 1259.0 | 39.182 |
| 1258.0 | 41.028 |
| 1257.0 | 42.314 |
| 1256.0 | 42.697 |
| 1255.0 | 42.075 |
| 1254.0 | 40.681 |
| 1253.0 | 39.107 |
| 1252.0 | 37.846 |
| 1251.0 | 37.146 |
| 1250.0 | 37.257 |
| 1249.0 | 38.262 |
| 1248.0 | 40.209 |
| 1247.0 | 42.852 |
| 1246.0 | 45.764 |
| 1245.0 | 48.413 |
| 1244.0 | 50.163 |
| 1243.0 | 50.701 |
| 1242.0 | 50.174 |
| 1241.0 | 49.069 |
| 1240.0 | 48.062 |
| 1239.0 | 47.646 |
| 1238.0 | 47.996 |
| 1237.0 | 49.031 |
| 1236.0 | 50.397 |
| 1235.0 | 51.489 |
| 1234.0 | 51.706 |
| 1233.0 | 50.713 |
| 1232.0 | 48.698 |
| 1231.0 | 46.219 |
| 1230.0 | 43.889 |
| 1229.0 | 42.248 |
| 1228.0 | 41.626 |
| 1227.0 | 41.985 |
| 1226.0 | 43.075 |
| 1225.0 | 44.381 |
| 1224.0 | 45.191 |
| 1223.0 | 44.846 |
| 1222.0 | 42.987 |
| 1221.0 | 40.121 |
| 1220.0 | 36.828 |
| 1219.0 | 33.732 |
| 1218.0 | 31.425 |
| 1217.0 | 30.096 |
| 1216.0 | 29.849 |
| 1215.0 | 30.592 |
| 1214.0 | 32.136 |
| 1213.0 | 34.082 |
| 1212.0 | 35.811 |
| 1211.0 | 36.624 |
| 1210.0 | 36 |
| 1209.0 | 34.052 |
| 1208.0 | 31.355 |
| 1207.0 | 28.648 |
| 1206.0 | 26.657 |
| 1205.0 | 25.602 |
| 1204.0 | 25.574 |
| 1203.0 | 26.677 |
| 1202.0 | 28.782 |
| 1201.0 | 31.661 |
| 1200.0 | 34.913 |
| 1199.0 | 37.334 |
| 1198.0 | 38.14 |
| 1197.0 | 37.242 |
| 1196.0 | 35.227 |
| 1195.0 | 33.135 |
| 1194.0 | 31.72 |
| 1193.0 | 31.483 |
| 1192.0 | 32.679 |
| 1191.0 | 35.595 |
| 1190.0 | 39.72 |
| 1189.0 | 44.72 |
| 1188.0 | 48.88 |
| 1187.0 | 50.852 |
| 1186.0 | 50.23 |
| 1185.0 | 47.764 |
| 1184.0 | 44.851 |
| 1183.0 | 42.634 |
| 1182.0 | 41.803 |
| 1181.0 | 42.551 |
| 1180.0 | 44.77 |
| 1179.0 | 47.895 |
| 1178.0 | 50.973 |
| 1177.0 | 52.726 |
| 1176.0 | 52.331 |
| 1175.0 | 50.064 |
| 1174.0 | 46.714 |
| 1173.0 | 43.554 |
| 1172.0 | 41.286 |
| 1171.0 | 40.153 |
| 1170.0 | 40.09 |
| 1169.0 | 40.649 |
| 1168.0 | 41.111 |
| 1167.0 | 40.709 |
| 1166.0 | 38.848 |
| 1165.0 | 35.788 |
| 1164.0 | 32.261 |
| 1163.0 | 28.992 |
| 1162.0 | 26.413 |
| 1161.0 | 24.75 |
| 1160.0 | 23.935 |
| 1159.0 | 23.814 |
| 1158.0 | 24.166 |
| 1157.0 | 24.682 |
| 1156.0 | 25.053 |
| 1155.0 | 25.019 |
| 1154.0 | 24.609 |
| 1153.0 | 24.008 |
| 1152.0 | 23.449 |
| 1151.0 | 23.212 |
| 1150.0 | 23.463 |
| 1149.0 | 24.209 |
| 1148.0 | 25.382 |
| 1147.0 | 26.773 |
| 1146.0 | 27.944 |
| 1145.0 | 28.741 |
| 1144.0 | 28.991 |
| 1143.0 | 28.814 |
| 1142.0 | 28.528 |
| 1141.0 | 28.473 |
| 1140.0 | 28.911 |
| 1139.0 | 29.975 |
| 1138.0 | 31.652 |
| 1137.0 | 33.87 |
| 1136.0 | 36.458 |
| 1135.0 | 38.741 |
| 1134.0 | 40.551 |
| 1133.0 | 41.712 |
| 1132.0 | 42.569 |
| 1131.0 | 43.453 |
| 1130.0 | 44.671 |
| 1129.0 | 46.57 |
| 1128.0 | 49.324 |
| 1127.0 | 52.762 |
| 1126.0 | 56.28 |
| 1125.0 | 59.763 |
| 1124.0 | 62.549 |
| 1123.0 | 64.321 |
| 1122.0 | 65.5 |
| 1121.0 | 66.168 |
| 1120.0 | 66.443 |
| 1119.0 | 66.163 |
| 1118.0 | 65.146 |
| 1117.0 | 63.225 |
| 1116.0 | 60.754 |
| 1115.0 | 58.286 |
| 1114.0 | 56.396 |
| 1113.0 | 55.497 |
| 1112.0 | 55.581 |
| 1111.0 | 56.291 |
| 1110.0 | 56.831 |
| 1109.0 | 56.277 |
| 1108.0 | 54.113 |
| 1107.0 | 50.628 |
| 1106.0 | 46.657 |
| 1105.0 | 43.088 |
| 1104.0 | 40.689 |
| 1103.0 | 39.685 |
| 1102.0 | 40.135 |
| 1101.0 | 41.944 |
| 1100.0 | 44.594 |
| 1099.0 | 47.631 |
| 1098.0 | 50.143 |
| 1097.0 | 51.623 |
| 1096.0 | 51.921 |
| 1095.0 | 51.429 |
| 1094.0 | 50.79 |
| 1093.0 | 50.662 |
| 1092.0 | 51.299 |
| 1091.0 | 52.614 |
| 1090.0 | 54.259 |
| 1089.0 | 55.731 |
| 1088.0 | 56.583 |
| 1087.0 | 56.742 |
| 1086.0 | 56.578 |
| 1085.0 | 56.579 |
| 1084.0 | 57.223 |
| 1083.0 | 58.54 |
| 1082.0 | 60.338 |
| 1081.0 | 61.801 |
| 1080.0 | 62.538 |
| 1079.0 | 62.151 |
| 1078.0 | 60.867 |
| 1077.0 | 59.295 |
| 1076.0 | 58.065 |
| 1075.0 | 57.51 |
| 1074.0 | 57.565 |
| 1073.0 | 57.793 |
| 1072.0 | 57.751 |
| 1071.0 | 57.157 |
| 1070.0 | 56.142 |
| 1069.0 | 55.134 |
| 1068.0 | 54.511 |
| 1067.0 | 54.564 |
| 1066.0 | 55.27 |
| 1065.0 | 56.293 |
| 1064.0 | 57.132 |
| 1063.0 | 57.432 |
| 1062.0 | 57.09 |
| 1061.0 | 56.471 |
| 1060.0 | 56.03 |
| 1059.0 | 56.184 |
| 1058.0 | 57.06 |
| 1057.0 | 58.504 |
| 1056.0 | 60.145 |
| 1055.0 | 61.376 |
| 1054.0 | 61.93 |
| 1053.0 | 61.859 |
| 1052.0 | 61.521 |
| 1051.0 | 61.427 |
| 1050.0 | 62.087 |
| 1049.0 | 63.455 |
| 1048.0 | 65.308 |
| 1047.0 | 66.994 |
| 1046.0 | 68.111 |
| 1045.0 | 68.368 |
| 1044.0 | 68.145 |
| 1043.0 | 67.918 |
| 1042.0 | 68.101 |
| 1041.0 | 68.677 |
| 1040.0 | 69.27 |
| 1039.0 | 69.257 |
| 1038.0 | 68.364 |
| 1037.0 | 66.778 |
| 1036.0 | 65.148 |
| 1035.0 | 64.126 |
| 1034.0 | 64.067 |
| 1033.0 | 64.737 |
| 1032.0 | 65.576 |
| 1031.0 | 65.947 |
| 1030.0 | 65.376 |
| 1029.0 | 64.098 |
| 1028.0 | 62.697 |
| 1027.0 | 61.89 |
| 1026.0 | 62.22 |
| 1025.0 | 63.436 |
| 1024.0 | 64.919 |
| 1023.0 | 65.995 |
| 1022.0 | 66.136 |
| 1021.0 | 65.521 |
| 1020.0 | 64.713 |
| 1019.0 | 64.45 |
| 1018.0 | 65.157 |
| 1017.0 | 66.915 |
| 1016.0 | 69.116 |
| 1015.0 | 71.181 |
| 1014.0 | 72.452 |
| 1013.0 | 72.72 |
| 1012.0 | 72.345 |
| 1011.0 | 72.057 |
| 1010.0 | 72.151 |
| 1009.0 | 72.66 |
| 1008.0 | 73.164 |
| 1007.0 | 73.13 |
| 1006.0 | 72.353 |
| 1005.0 | 71.147 |
| 1004.0 | 70.065 |
| 1003.0 | 69.658 |
| 1002.0 | 70.067 |
| 1001.0 | 70.995 |
| 1000.0 | 71.861 |
| 999.0 | 72.226 |
| 998.0 | 72.143 |
| 997.0 | 72.013 |
| 996.0 | 72.288 |
| 995.0 | 73.061 |
| 994.0 | 73.99 |
| 993.0 | 74.437 |
| 992.0 | 74.033 |
| 991.0 | 72.862 |
| 990.0 | 71.85 |
| 989.0 | 71.558 |
| 988.0 | 72.29 |
| 987.0 | 73.651 |
| 986.0 | 74.774 |
| 985.0 | 74.996 |
| 984.0 | 74.217 |
| 983.0 | 73.134 |
| 982.0 | 72.476 |
| 981.0 | 72.779 |
| 980.0 | 73.937 |
| 979.0 | 75.166 |
| 978.0 | 75.771 |
| 977.0 | 75.28 |
| 976.0 | 74.072 |
| 975.0 | 72.983 |
| 974.0 | 72.648 |
| 973.0 | 73.284 |
| 972.0 | 74.335 |
| 971.0 | 74.995 |
| 970.0 | 74.654 |
| 969.0 | 73.388 |
| 968.0 | 72.1 |
| 967.0 | 71.67 |
| 966.0 | 72.25 |
| 965.0 | 73.4 |
| 964.0 | 74.06 |
| 963.0 | 73.418 |
| 962.0 | 71.636 |
| 961.0 | 69.791 |
| 960.0 | 68.941 |
| 959.0 | 69.629 |
| 958.0 | 71.283 |
| 957.0 | 72.585 |
| 956.0 | 72.572 |
| 955.0 | 71.243 |
| 954.0 | 69.446 |
| 953.0 | 68.612 |
| 952.0 | 69.248 |
| 951.0 | 70.964 |
| 950.0 | 72.559 |
| 949.0 | 72.821 |
| 948.0 | 71.764 |
| 947.0 | 70.369 |
| 946.0 | 69.889 |
| 945.0 | 70.964 |
| 944.0 | 73.22 |
| 943.0 | 75.301 |
| 942.0 | 76.109 |
| 941.0 | 75.338 |
| 940.0 | 73.712 |
| 939.0 | 72.743 |
| 938.0 | 73.366 |
| 937.0 | 75.689 |
| 936.0 | 78.755 |
| 935.0 | 81.188 |
| 934.0 | 81.871 |
| 933.0 | 81.005 |
| 932.0 | 79.528 |
| 931.0 | 78.654 |
| 930.0 | 79.051 |
| 929.0 | 80.7 |
| 928.0 | 82.83 |
| 927.0 | 84.587 |
| 926.0 | 85.405 |
| 925.0 | 85.554 |
| 924.0 | 85.557 |
| 923.0 | 85.935 |
| 922.0 | 86.902 |
| 921.0 | 88.203 |
| 920.0 | 89.482 |
| 919.0 | 90.462 |
| 918.0 | 91.124 |
| 917.0 | 91.471 |
| 916.0 | 91.702 |
| 915.0 | 91.903 |
| 914.0 | 92.051 |
| 913.0 | 92.185 |
| 912.0 | 92.314 |
| 911.0 | 92.444 |
| 910.0 | 92.569 |
| 909.0 | 92.725 |
| 908.0 | 92.888 |
| 907.0 | 93.031 |
| 906.0 | 93.152 |
| 905.0 | 93.251 |
| 904.0 | 93.35 |
| 903.0 | 93.442 |
| 902.0 | 93.555 |
| 901.0 | 93.675 |
| 900.0 | 93.656 |
| 899.0 | 98.203 |
| 898.0 | 99.117 |
| 897.0 | 97.066 |
| 896.0 | 92.777 |
| 895.0 | 92.704 |
| 894.0 | 93.212 |
| 893.0 | 94.525 |
| 892.0 | 94.033 |
| 891.0 | 94.437 |
| 890.0 | 95.159 |
| 889.0 | 96.382 |
| 888.0 | 96.509 |
| 887.0 | 92.597 |
| 886.0 | 94.352 |
| 885.0 | 96.778 |
| 884.0 | 96.762 |
| 883.0 | 96.547 |
| 882.0 | 94.212 |
| 881.0 | 94.523 |
| 880.0 | 93.441 |
| 879.0 | 95.342 |
| 878.0 | 98.89 |
| 877.0 | 99.956 |
| 876.0 | 96.834 |
| 875.0 | 92.437 |
| 874.0 | 92.045 |
| 873.0 | 94.237 |
| 872.0 | 98.142 |
| 871.0 | 97.896 |
| 870.0 | 98.105 |
| 869.0 | 98.036 |
| 868.0 | 93.631 |
| 867.0 | 93.866 |
| 866.0 | 94.116 |
| 865.0 | 94.399 |
| 864.0 | 98.565 |
| 863.0 | 98.768 |
| 862.0 | 96.659 |
| 861.0 | 94.247 |
| 860.0 | 97.251 |
| 859.0 | 96.907 |
| 858.0 | 94.85 |
| 857.0 | 92.753 |
| 856.0 | 93.13 |
| 855.0 | 91.019 |
| 854.0 | 94.465 |
| 853.0 | 94.972 |
| 852.0 | 97.245 |
| 851.0 | 94.42 |
| 850.0 | 90.823 |
| 849.0 | 96.787 |
| 848.0 | 99.626 |
| 847.0 | 98.748 |
| 846.0 | 97.53 |
| 845.0 | 97.505 |
| 844.0 | 94.494 |
| 843.0 | 96.245 |
| 842.0 | 97.584 |
| 841.0 | 99.104 |
| 840.0 | 98.915 |
| 839.0 | 95.371 |
| 838.0 | 95.318 |
| 837.0 | 99.565 |
| 836.0 | 96.822 |
| 835.0 | 98.139 |
| 834.0 | 99.278 |
| 833.0 | 97.526 |
| 832.0 | 97.92 |
| 831.0 | 99.596 |
| 830.0 | 97.935 |
| 829.0 | 99.618 |
| 828.0 | 96.617 |
| 827.0 | 98.059 |
| 826.0 | 97.039 |
| 825.0 | 98.696 |
| 824.0 | 99.137 |
| 823.0 | 99.165 |
| 822.0 | 96.834 |
| 821.0 | 98.426 |
| 820.0 | 99.595 |
| 819.0 | 99.866 |
| 818.0 | 99.704 |
| 817.0 | 98.967 |
| 816.0 | 98.774 |
| 815.0 | 99.495 |
| 814.0 | 98.23 |
| 813.0 | 98.436 |
| 812.0 | 99.884 |
| 811.0 | 98.899 |
| 810.0 | 98.035 |
| 809.0 | 98.419 |
| 808.0 | 99.581 |
| 807.0 | 99.221 |
| 806.0 | 98.951 |
| 805.0 | 99.795 |
| 804.0 | 98.674 |
| 803.0 | 99.295 |
| 802.0 | 99.614 |
| 801.0 | 99.412 |
| 800.0 | 99.544 |
| 799.0 | 98.839 |
| 798.0 | 100 |
| 797.0 | 99.921 |
| 796.0 | 99.894 |
| 795.0 | 99.293 |
| 794.0 | 99.088 |
| 793.0 | 98.824 |
| 792.0 | 99.386 |
| 791.0 | 99.655 |
| 790.0 | 98.325 |
| 789.0 | 99.033 |
| 788.0 | 98.836 |
| 787.0 | 98.752 |
| 786.0 | 99.98 |
| 785.0 | 99.22 |
| 784.0 | 98.868 |
| 783.0 | 97.869 |
| 782.0 | 99.294 |
| 781.0 | 99.296 |
| 780.0 | 99.212 |
| 779.0 | 99.539 |
| 778.0 | 99.024 |
| 777.0 | 99.097 |
| 776.0 | 98.671 |
| 775.0 | 98.694 |
| 774.0 | 98.758 |
| 773.0 | 99.557 |
| 772.0 | 99.196 |
| 771.0 | 99.587 |
| 770.0 | 98.486 |
| 769.0 | 98.332 |
| 768.0 | 99.065 |
| 767.0 | 98.865 |
| 766.0 | 99.203 |
| 765.0 | 99.739 |
| 764.0 | 98.888 |
| 763.0 | 98.76 |
| 762.0 | 99.295 |
| 761.0 | 99.722 |
| 760.0 | 99.02 |
| 759.0 | 98.285 |
| 758.0 | 98.978 |
| 757.0 | 99.26 |
| 756.0 | 98.919 |
| 755.0 | 99.229 |
| 754.0 | 98.97 |
| 753.0 | 99.265 |
| 752.0 | 99.538 |
| 751.0 | 98.931 |
| 750.0 | 98.917 |
| 749.0 | 99.029 |
| 748.0 | 99.259 |
| 747.0 | 99.324 |
| 746.0 | 98.892 |
| 745.0 | 98.705 |
| 744.0 | 98.723 |
| 743.0 | 99.63 |
| 742.0 | 98.978 |
| 741.0 | 98.621 |
| 740.0 | 99.286 |
| 739.0 | 99.297 |
| 738.0 | 98.792 |
| 737.0 | 98.604 |
| 736.0 | 98.282 |
| 735.0 | 98.571 |
| 734.0 | 98.573 |
| 733.0 | 99.196 |
| 732.0 | 99.37 |
| 731.0 | 99.134 |
| 730.0 | 98.645 |
| 729.0 | 98.787 |
| 728.0 | 98.304 |
| 727.0 | 98.356 |
| 726.0 | 98.827 |
| 725.0 | 99.641 |
| 724.0 | 98.931 |
| 723.0 | 98.767 |
| 722.0 | 99.307 |
| 721.0 | 99.297 |
| 720.0 | 99.472 |
| 719.0 | 98.873 |
| 718.0 | 98.788 |
| 717.0 | 99.293 |
| 716.0 | 98.755 |
| 715.0 | 98.836 |
| 714.0 | 99.394 |
| 713.0 | 98.919 |
| 712.0 | 98.544 |
| 711.0 | 98.886 |
| 710.0 | 98.788 |
| 709.0 | 98.76 |
| 708.0 | 98.668 |
| 707.0 | 98.509 |
| 706.0 | 98.302 |
| 705.0 | 98.52 |
| 704.0 | 98.833 |
| 703.0 | 98.779 |
| 702.0 | 98.473 |
| 701.0 | 98.258 |
| 700.0 | 98.602 |
| 699.0 | 99.046 |
| 698.0 | 99.235 |
| 697.0 | 98.713 |
| 696.0 | 98.372 |
| 695.0 | 98.48 |
| 694.0 | 98.61 |
| 693.0 | 98.715 |
| 692.0 | 98.659 |
| 691.0 | 98.868 |
| 690.0 | 99.099 |
| 689.0 | 99.066 |
| 688.0 | 98.776 |
| 687.0 | 98.895 |
| 686.0 | 98.554 |
| 685.0 | 98.554 |
| 684.0 | 99.018 |
| 683.0 | 99.269 |
| 682.0 | 99.255 |
| 681.0 | 98.541 |
| 680.0 | 98.032 |
| 679.0 | 98.742 |
| 678.0 | 99.04 |
| 677.0 | 98.829 |
| 676.0 | 98.726 |
| 675.0 | 98.838 |
| 674.0 | 98.647 |
| 673.0 | 98.296 |
| 672.0 | 97.46 |
| 671.0 | 97.255 |
| 670.0 | 75.321 |
| 669.0 | 27.267 |
| 668.0 | 1.678 |
| 667.0 | 0.054 |
| 666.0 | 0.004 |
| 665.0 | 0.001 |
| 664.0 | 0.001 |
| 663.0 | 0 |
| 662.0 | 0 |
| 661.0 | 0 |
| 660.0 | 0 |
| 659.0 | 0 |
| 658.0 | 0 |
| 657.0 | 0 |
| 656.0 | 0 |
| 655.0 | 0 |
| 654.0 | 0 |
| 653.0 | 0 |
| 652.0 | 0.001 |
| 651.0 | 0.001 |
| 650.0 | 0.001 |
| 649.0 | 0.008 |
| 648.0 | 0.142 |
| 647.0 | 9.262 |
| 646.0 | 48.73 |
| 645.0 | 83.044 |
| 644.0 | 94.784 |
| 643.0 | 97.538 |
| 642.0 | 97.731 |
| 641.0 | 97.787 |
| 640.0 | 97.982 |
| 639.0 | 97.651 |
| 638.0 | 98.428 |
| 637.0 | 99.578 |
| 636.0 | 99.1 |
| 635.0 | 98.626 |
| 634.0 | 97.982 |
| 633.0 | 98.351 |
| 632.0 | 99 |
| 631.0 | 99.132 |
| 630.0 | 98.9 |
| 629.0 | 98.92 |
| 628.0 | 98.478 |
| 627.0 | 98.035 |
| 626.0 | 98.571 |
| 625.0 | 99.174 |
| 624.0 | 99.014 |
| 623.0 | 98.633 |
| 622.0 | 97.875 |
| 621.0 | 98.559 |
| 620.0 | 99.081 |
| 619.0 | 99.367 |
| 618.0 | 98.914 |
| 617.0 | 98.909 |
| 616.0 | 98.722 |
| 615.0 | 98.818 |
| 614.0 | 99.572 |
| 613.0 | 99.774 |
| 612.0 | 99.374 |
| 611.0 | 98.462 |
| 610.0 | 98.153 |
| 609.0 | 98.089 |
| 608.0 | 99.103 |
| 607.0 | 99.572 |
| 606.0 | 99.057 |
| 605.0 | 98.585 |
| 604.0 | 98.766 |
| 603.0 | 98.003 |
| 602.0 | 99.011 |
| 601.0 | 99.247 |
| 600.0 | 98.687 |
| 599.0 | 98.757 |
| 598.0 | 98.406 |
| 597.0 | 98.338 |
| 596.0 | 99.026 |
| 595.0 | 99.326 |
| 594.0 | 98.791 |
| 593.0 | 98.63 |
| 592.0 | 98.615 |
| 591.0 | 97.97 |
| 590.0 | 99.13 |
| 589.0 | 99.373 |
| 588.0 | 98.701 |
| 587.0 | 98.356 |
| 586.0 | 98.669 |
| 585.0 | 98.284 |
| 584.0 | 99.391 |
| 583.0 | 99.718 |
| 582.0 | 98.381 |
| 581.0 | 98.347 |
| 580.0 | 98.296 |
| 579.0 | 97.952 |
| 578.0 | 99.066 |
| 577.0 | 99.218 |
| 576.0 | 98.301 |
| 575.0 | 98.979 |
| 574.0 | 98.485 |
| 573.0 | 97.855 |
| 572.0 | 98.67 |
| 571.0 | 99.185 |
| 570.0 | 98.441 |
| 569.0 | 98.33 |
| 568.0 | 98.337 |
| 567.0 | 98.722 |
| 566.0 | 99.002 |
| 565.0 | 99.325 |
| 564.0 | 98.321 |
| 563.0 | 98.335 |
| 562.0 | 98.278 |
| 561.0 | 98.796 |
| 560.0 | 98.159 |
| 559.0 | 98.974 |
| 558.0 | 98.769 |
| 557.0 | 98.331 |
| 556.0 | 98.324 |
| 555.0 | 98.616 |
| 554.0 | 97.938 |
| 553.0 | 97.779 |
| 552.0 | 98.651 |
| 551.0 | 98.298 |
| 550.0 | 98.19 |
| 549.0 | 98.728 |
| 548.0 | 98.341 |
| 547.0 | 98.685 |
| 546.0 | 98.675 |
| 545.0 | 98.366 |
| 544.0 | 98.658 |
| 543.0 | 98.676 |
| 542.0 | 97.948 |
| 541.0 | 98.39 |
| 540.0 | 98.899 |
| 539.0 | 98.417 |
| 538.0 | 98.597 |
| 537.0 | 98.395 |
| 536.0 | 98.056 |
| 535.0 | 98.225 |
| 534.0 | 98.391 |
| 533.0 | 98.025 |
| 532.0 | 98.271 |
| 531.0 | 98.346 |
| 530.0 | 97.686 |
| 529.0 | 98.206 |
| 528.0 | 98.614 |
| 527.0 | 98.34 |
| 526.0 | 98.652 |
| 525.0 | 98.478 |
| 524.0 | 97.641 |
| 523.0 | 98.366 |
| 522.0 | 98.183 |
| 521.0 | 98.101 |
| 520.0 | 98.065 |
| 519.0 | 98.237 |
| 518.0 | 97.648 |
| 517.0 | 98.14 |
| 516.0 | 98.138 |
| 515.0 | 97.903 |
| 514.0 | 98.085 |
| 513.0 | 98.355 |
| 512.0 | 98.017 |
| 511.0 | 98.123 |
| 510.0 | 98.536 |
| 509.0 | 97.587 |
| 508.0 | 98.229 |
| 507.0 | 98.275 |
| 506.0 | 97.769 |
| 505.0 | 98.552 |
| 504.0 | 98.244 |
| 503.0 | 98.259 |
| 502.0 | 98.362 |
| 501.0 | 97.93 |
| 500.0 | 97.899 |
| 499.0 | 98.318 |
| 498.0 | 98.276 |
| 497.0 | 98.176 |
| 496.0 | 98.108 |
| 495.0 | 98.015 |
| 494.0 | 97.998 |
| 493.0 | 98.031 |
| 492.0 | 97.976 |
| 491.0 | 97.957 |
| 490.0 | 97.986 |
| 489.0 | 97.921 |
| 488.0 | 97.831 |
| 487.0 | 97.855 |
| 486.0 | 97.882 |
| 485.0 | 97.928 |
| 484.0 | 98.04 |
| 483.0 | 98.1 |
| 482.0 | 98.104 |
| 481.0 | 98.103 |
| 480.0 | 98.078 |
| 479.0 | 98.09 |
| 478.0 | 98.117 |
| 477.0 | 98.049 |
| 476.0 | 97.923 |
| 475.0 | 97.713 |
| 474.0 | 97.523 |
| 473.0 | 97.545 |
| 472.0 | 97.394 |
| 471.0 | 94.34 |
| 470.0 | 83.205 |
| 469.0 | 63.493 |
| 468.0 | 42.434 |
| 467.0 | 27.044 |
| 466.0 | 18.133 |
| 465.0 | 12.854 |
| 464.0 | 9.14 |
| 463.0 | 7.069 |
| 462.0 | 7.132 |
| 461.0 | 7.629 |
| 460.0 | 6.469 |
| 459.0 | 4.643 |
| 458.0 | 3.688 |
| 457.0 | 2.864 |
| 456.0 | 1.777 |
| 455.0 | 1.012 |
| 454.0 | 0.517 |
| 453.0 | 0.154 |
| 452.0 | 0.012 |
| 451.0 | 0.004 |
| 450.0 | 0.005 |
| 449.0 | 0.004 |
| 448.0 | 0.001 |
| 447.0 | 0.004 |
| 446.0 | 0.005 |
| 445.0 | 0.005 |
| 444.0 | 0.005 |
| 443.0 | 0.004 |
| 442.0 | 0.002 |
| 441.0 | 0.005 |
| 440.0 | 0.007 |
| 439.0 | 0.004 |
| 438.0 | 0.005 |
| 437.0 | 0.004 |
| 436.0 | 0.001 |
| 435.0 | 0.004 |
| 434.0 | 0.007 |
| 433.0 | 0.004 |
| 432.0 | 0.004 |
| 431.0 | 0.003 |
| 430.0 | 0.002 |
| 429.0 | 0.003 |
| 428.0 | 0.007 |
| 427.0 | 0.005 |
| 426.0 | 0.005 |
| 425.0 | 0.004 |
| 424.0 | 0.002 |
| 423.0 | 0.005 |
| 422.0 | 0.006 |
| 421.0 | 0.004 |
| 420.0 | 0.005 |
| 419.0 | 0.003 |
| 418.0 | 0.002 |
| 417.0 | 0.004 |
| 416.0 | 0.007 |
| 415.0 | 0.007 |
| 414.0 | 0.007 |
| 413.0 | 0.003 |
| 412.0 | 0.002 |
| 411.0 | 0.006 |
| 410.0 | 0.007 |
| 409.0 | 0.003 |
| 408.0 | 0.005 |
| 407.0 | 0.003 |
| 406.0 | 0.003 |
| 405.0 | 0.006 |
| 404.0 | 0.007 |
| 403.0 | 0.007 |
| 402.0 | 0.007 |
| 401.0 | 0.002 |
| 400.0 | 0.002 |
| 399.0 | 0.004 |
| 398.0 | 0.006 |
| 397.0 | 0.006 |
| 396.0 | 0.006 |
| 395.0 | 0.003 |
| 394.0 | 0.002 |
| 393.0 | 0.005 |
| 392.0 | 0.007 |
| 391.0 | 0.003 |
| 390.0 | 0.005 |
| 389.0 | 0.003 |
| 388.0 | 0.002 |
| 387.0 | 0.005 |
| 386.0 | 0.006 |
| 385.0 | 0.006 |
| 384.0 | 0.005 |
| 383.0 | 0.003 |
| 382.0 | 0.003 |
| 381.0 | 0.006 |
| 380.0 | 0.005 |
| 379.0 | 0.005 |
| 378.0 | 0.006 |
| 377.0 | 0.004 |
| 376.0 | 0.004 |
| 375.0 | 0.005 |
| 374.0 | 0.005 |
| 373.0 | 0.001 |
| 372.0 | 0 |
| 371.0 | 0.003 |
| 370.0 | 0.006 |
| 369.0 | 0.006 |
| 368.0 | 0.005 |
| 367.0 | 0.002 |
| 366.0 | 0 |
| 365.0 | 0.004 |
| 364.0 | 0.005 |
| 363.0 | 0.005 |
| 362.0 | 0.005 |
| 361.0 | 0.002 |
| 360.0 | 0.001 |
| 359.0 | 0.005 |
| 358.0 | 0.007 |
| 357.0 | 0.005 |
| 356.0 | 0.005 |
| 355.0 | 0.002 |
| 354.0 | 0 |
| 353.0 | 0.005 |
| 352.0 | 0.006 |
| 351.0 | 0.003 |
| 350.0 | 0.004 |
| 349.0 | 0.002 |
| 348.0 | 0.001 |
| 347.0 | 0.004 |
| 346.0 | 0.006 |
| 345.0 | 0.004 |
| 344.0 | 0.004 |
| 343.0 | 0.002 |
| 342.0 | 0.001 |
| 341.0 | 0.006 |
| 340.0 | 0.006 |
| 339.0 | 0.007 |
| 338.0 | 0.004 |
| 337.0 | 0.002 |
| 336.0 | 0.001 |
| 335.0 | 0.006 |
| 334.0 | 0.006 |
| 333.0 | 0.008 |
| 332.0 | 0.005 |
| 331.0 | 0.002 |
| 330.0 | 0.002 |
| 329.0 | 0.006 |
| 328.0 | 0.007 |
| 327.0 | 0.007 |
| 326.0 | 0.005 |
| 325.0 | 0.003 |
| 324.0 | 0.002 |
| 323.0 | 0.006 |
| 322.0 | 0.007 |
| 321.0 | 0.006 |
| 320.0 | 0.006 |
| 319.0 | 0.002 |
| 318.0 | 0.005 |
| 317.0 | 0.005 |
| 316.0 | 0.005 |
| 315.0 | 0.005 |
| 314.0 | 0.005 |
| 313.0 | 0.001 |
| 312.0 | 0.002 |
| 311.0 | 0.005 |
| 310.0 | 0.006 |
| 309.0 | 0.005 |
| 308.0 | 0.006 |
| 307.0 | 0.004 |
| 306.0 | 0.001 |
| 305.0 | 0.006 |
| 304.0 | 0.006 |
| 303.0 | 0.006 |
| 302.0 | 0.004 |
| 301.0 | 0.001 |
| 300.0 | 0.001 |
| 299.0 | 0.005 |
| 298.0 | 0.006 |
| 297.0 | 0.003 |
| 296.0 | 0.005 |
| 295.0 | 0.003 |
| 294.0 | 0 |
| 293.0 | 0.006 |
| 292.0 | 0.004 |
| 291.0 | 0.002 |
| 290.0 | 0.005 |
| 289.0 | 0.002 |
| 288.0 | 0 |
| 287.0 | 0.006 |
| 286.0 | 0.004 |
| 285.0 | 0.006 |
| 284.0 | 0.003 |
| 283.0 | 0.003 |
| 282.0 | 0 |
| 281.0 | 0.005 |
| 280.0 | 0.006 |
| 279.0 | 0.003 |
| 278.0 | 0.004 |
| 277.0 | 0.003 |
| 276.0 | 0 |
| 275.0 | 0.007 |
| 274.0 | 0.005 |
| 273.0 | 0.004 |
| 272.0 | 0.006 |
| 271.0 | 0.001 |
| 270.0 | 0.001 |
| 269.0 | 0.005 |
| 268.0 | 0.006 |
| 267.0 | 0.004 |
| 266.0 | 0.002 |
| 265.0 | 0.001 |
| 264.0 | 0.001 |
| 263.0 | 0.005 |
| 262.0 | 0.007 |
| 261.0 | 0.002 |
| 260.0 | 0.006 |
| 259.0 | 0.001 |
| 258.0 | 0.002 |
| 257.0 | 0.006 |
| 256.0 | 0.007 |
| 255.0 | 0.002 |
| 254.0 | 0.006 |
| 253.0 | 0.001 |
| 252.0 | 0.002 |
| 251.0 | 0.005 |
| 250.0 | 0.007 |
| 249.0 | 0.001 |
| 248.0 | 0.006 |
| 247.0 | 0.001 |
| 246.0 | 0.002 |
| 245.0 | 0.005 |
| 244.0 | 0.007 |
| 243.0 | 0.003 |
| 242.0 | 0.007 |
| 241.0 | 0.003 |
| 240.0 | 0.003 |
| 239.0 | 0.005 |
| 238.0 | 0.007 |
| 237.0 | 0.004 |
| 236.0 | 0.007 |
| 235.0 | 0 |
| 234.0 | 0.003 |
| 233.0 | 0.006 |
| 232.0 | 0.007 |
| 231.0 | 0.006 |
| 230.0 | 0.007 |
| 229.0 | 0.001 |
| 228.0 | 0.003 |
| 227.0 | 0.006 |
| 226.0 | 0.007 |
| 225.0 | 0.007 |
| 224.0 | 0.006 |
| 223.0 | 0.002 |
| 222.0 | 0.003 |
| 221.0 | 0.008 |
| 220.0 | 0.009 |
| 219.0 | 0.004 |
| 218.0 | 0.006 |
| 217.0 | 0.002 |
| 216.0 | 0.002 |
| 215.0 | 0.008 |
| 214.0 | 0.007 |
| 213.0 | 0.007 |
| 212.0 | 0.006 |
| 211.0 | 0.003 |
| 210.0 | 0.004 |
| 209.0 | 0.008 |
| 208.0 | 0.008 |
| 207.0 | 0.005 |
| 206.0 | 0.007 |
| 205.0 | 0.004 |
| 204.0 | 0.005 |
| 203.0 | 0.011 |
| 202.0 | 0.011 |
| 201.0 | 0.009 |
| 200.0 | 0.01 |